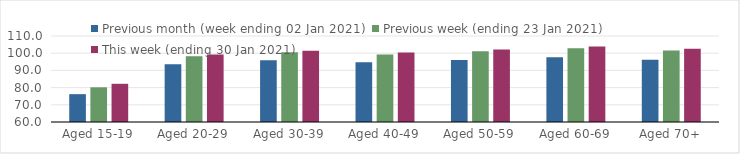
| Category | Previous month (week ending 02 Jan 2021) | Previous week (ending 23 Jan 2021) | This week (ending 30 Jan 2021) |
|---|---|---|---|
| Aged 15-19 | 76.18 | 80.17 | 82.21 |
| Aged 20-29 | 93.52 | 98.26 | 99.26 |
| Aged 30-39 | 95.93 | 100.52 | 101.37 |
| Aged 40-49 | 94.76 | 99.21 | 100.34 |
| Aged 50-59 | 96.09 | 101.1 | 102.17 |
| Aged 60-69 | 97.69 | 102.95 | 103.95 |
| Aged 70+ | 96.2 | 101.57 | 102.62 |